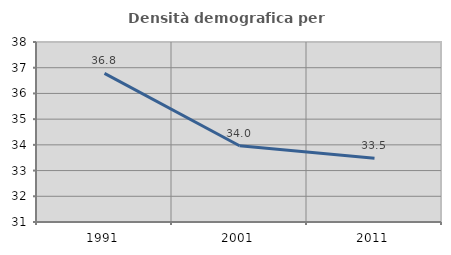
| Category | Densità demografica |
|---|---|
| 1991.0 | 36.778 |
| 2001.0 | 33.964 |
| 2011.0 | 33.479 |